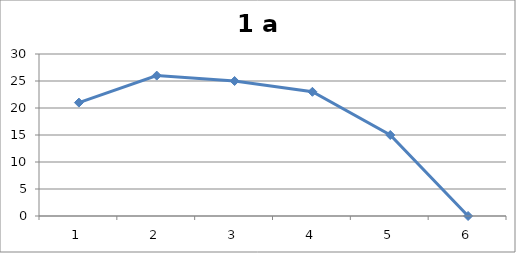
| Category | 2 класс |
|---|---|
| 0 | 21 |
| 1 | 26 |
| 2 | 25 |
| 3 | 23 |
| 4 | 15 |
| 5 | 0 |